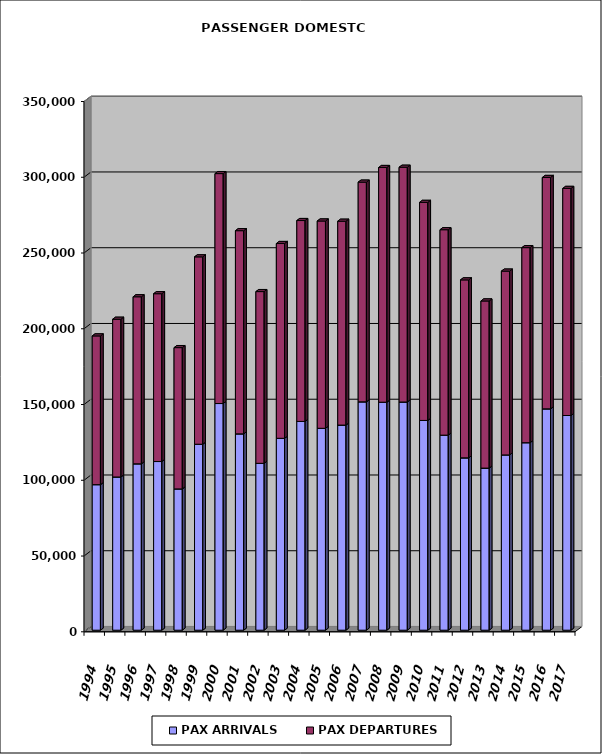
| Category | PAX ARRIVALS | PAX DEPARTURES |
|---|---|---|
| 1994.0 | 96070 | 98165 |
| 1995.0 | 101139 | 104086 |
| 1996.0 | 109810 | 110256 |
| 1997.0 | 111334 | 110761 |
| 1998.0 | 93263 | 93251 |
| 1999.0 | 122752 | 123655 |
| 2000.0 | 149610 | 151755 |
| 2001.0 | 129584 | 134108 |
| 2002.0 | 110141 | 113352 |
| 2003.0 | 126658 | 128561 |
| 2004.0 | 137800 | 132586 |
| 2005.0 | 133256 | 136822 |
| 2006.0 | 135395 | 134532 |
| 2007.0 | 150726 | 145000 |
| 2008.0 | 150484 | 154894 |
| 2009.0 | 150627 | 154927 |
| 2010.0 | 138453 | 143909 |
| 2011.0 | 128746 | 135592 |
| 2012.0 | 113755 | 117460 |
| 2013.0 | 106993 | 110306 |
| 2014.0 | 115701 | 121294 |
| 2015.0 | 123753 | 128753 |
| 2016.0 | 146086 | 152724 |
| 2017.0 | 141707 | 149874 |